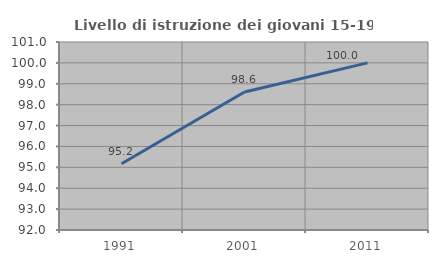
| Category | Livello di istruzione dei giovani 15-19 anni |
|---|---|
| 1991.0 | 95.17 |
| 2001.0 | 98.605 |
| 2011.0 | 100 |